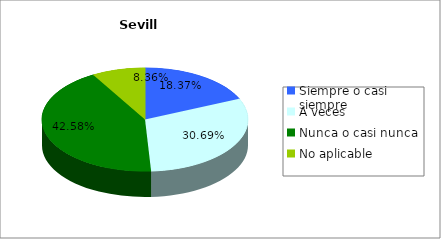
| Category | Sevilla |
|---|---|
| Siempre o casi siempre | 172338 |
| A veces | 287982 |
| Nunca o casi nunca | 399522 |
| No aplicable | 78425 |